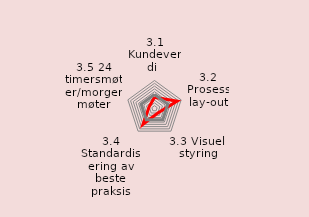
| Category | Series 0 | Series 1 |
|---|---|---|
| 3.1 Kundeverdi  | 4 | 5 |
| 3.2 Prosess lay-out | 8.5 | 5 |
| 3.3 Visuell styring | 2 | 5 |
| 3.4 Standardisering av beste praksis | 7 | 5 |
| 3.5 24 timersmøter/morgenmøter | 2 | 5 |